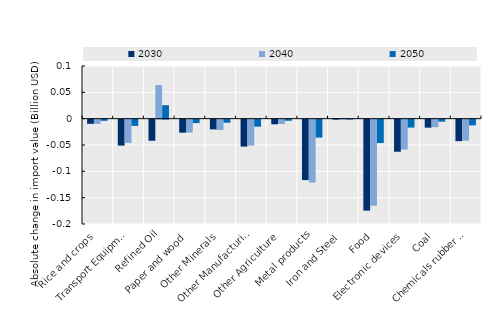
| Category | 2030 | 2040 | 2050 |
|---|---|---|---|
| Rice and crops | -0.008 | -0.008 | -0.002 |
| Transport Equipment | -0.049 | -0.044 | -0.012 |
| Refined Oil | -0.04 | 0.064 | 0.026 |
| Paper and wood | -0.025 | -0.025 | -0.007 |
| Other Minerals | -0.018 | -0.02 | -0.006 |
| Other Manufacturing | -0.051 | -0.049 | -0.013 |
| Other Agriculture | -0.009 | -0.008 | -0.002 |
| Metal products | -0.115 | -0.119 | -0.034 |
| Iron and Steel | 0.001 | 0.001 | 0 |
| Food | -0.173 | -0.163 | -0.044 |
| Electronic devices | -0.061 | -0.057 | -0.015 |
| Coal | -0.015 | -0.014 | -0.004 |
| Chemicals rubber and plastic | -0.041 | -0.04 | -0.011 |